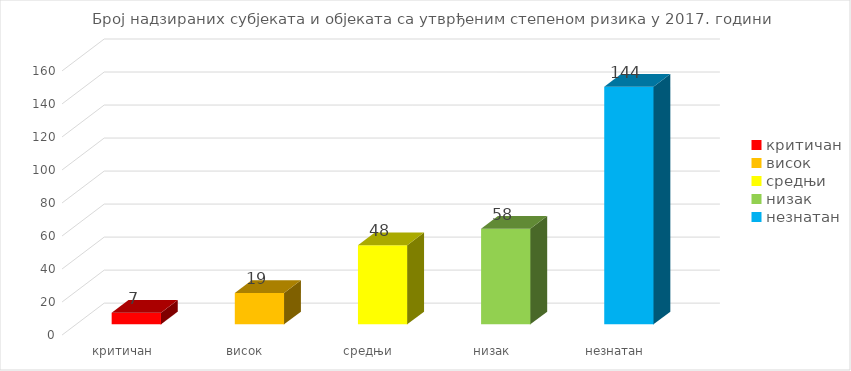
| Category | Series 0 |
|---|---|
| критичан | 7 |
| висок | 19 |
| средњи | 48 |
| низак | 58 |
| незнатан | 144 |